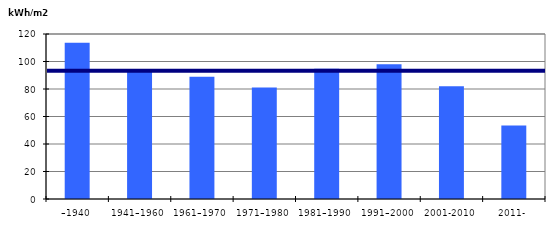
| Category | Byggårskategori |
|---|---|
| –1940 | 113.7 |
| 1941–1960 | 94.081 |
| 1961–1970 | 88.984 |
| 1971–1980 | 81.009 |
| 1981–1990 | 94.719 |
| 1991–2000 | 97.969 |
| 2001-2010 | 81.948 |
| 2011- | 53.394 |